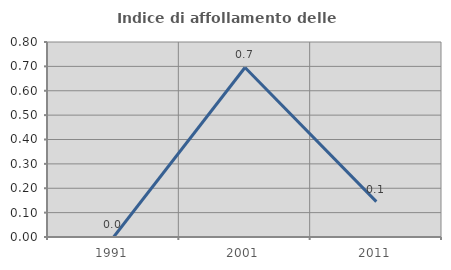
| Category | Indice di affollamento delle abitazioni  |
|---|---|
| 1991.0 | 0 |
| 2001.0 | 0.695 |
| 2011.0 | 0.145 |